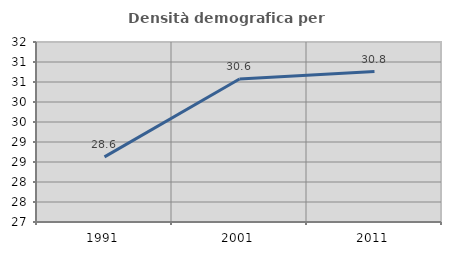
| Category | Densità demografica |
|---|---|
| 1991.0 | 28.627 |
| 2001.0 | 30.576 |
| 2011.0 | 30.762 |